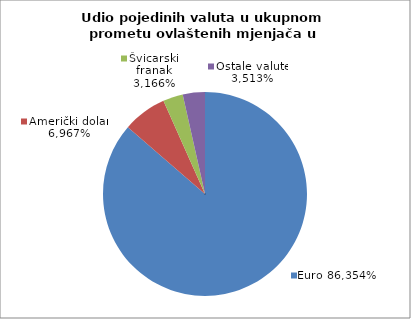
| Category | EUR |
|---|---|
| 0 | 0.864 |
| 1 | 0.07 |
| 2 | 0.032 |
| 3 | 0.035 |